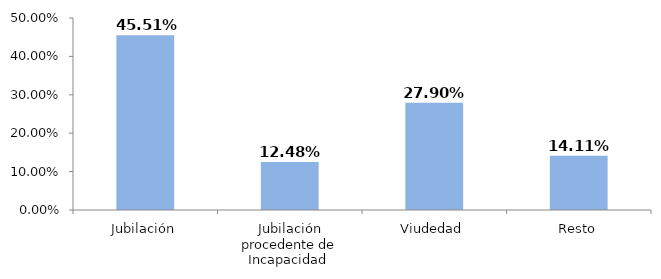
| Category | Series 0 |
|---|---|
| Jubilación | 0.455 |
| Jubilación procedente de Incapacidad  | 0.125 |
| Viudedad | 0.279 |
| Resto | 0.141 |